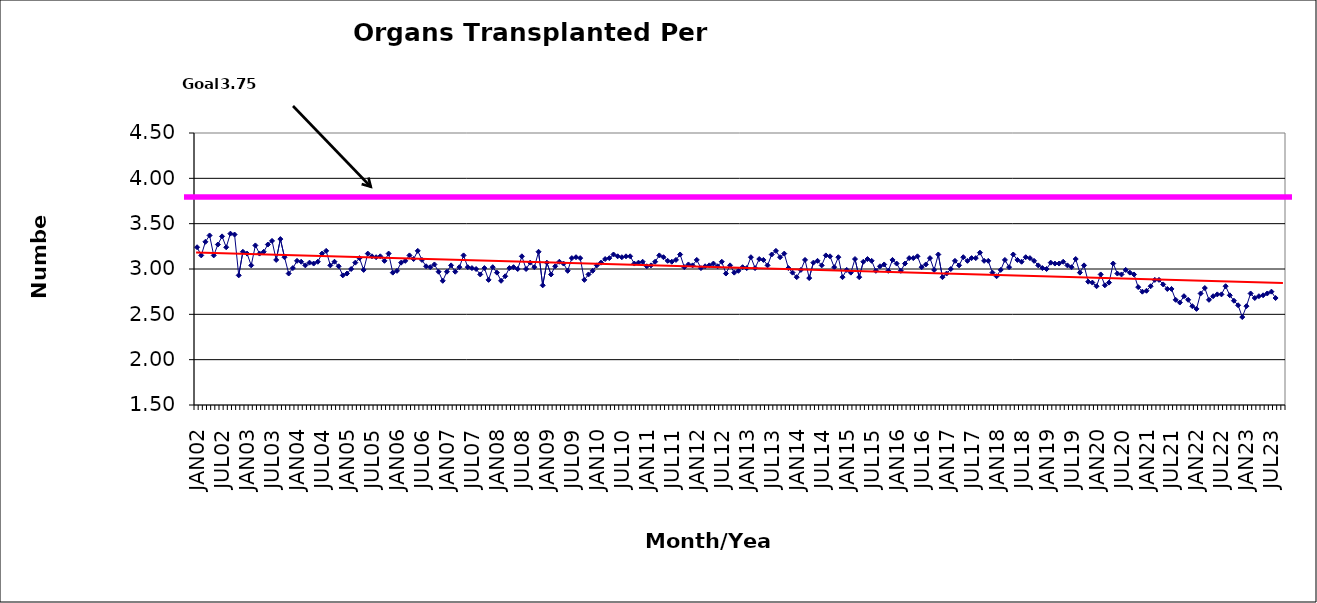
| Category | Series 0 |
|---|---|
| JAN02 | 3.24 |
| FEB02 | 3.15 |
| MAR02 | 3.3 |
| APR02 | 3.37 |
| MAY02 | 3.15 |
| JUN02 | 3.27 |
| JUL02 | 3.36 |
| AUG02 | 3.24 |
| SEP02 | 3.39 |
| OCT02 | 3.38 |
| NOV02 | 2.93 |
| DEC02 | 3.19 |
| JAN03 | 3.17 |
| FEB03 | 3.04 |
| MAR03 | 3.26 |
| APR03 | 3.17 |
| MAY03 | 3.19 |
| JUN03 | 3.27 |
| JUL03 | 3.31 |
| AUG03 | 3.1 |
| SEP03 | 3.33 |
| OCT03 | 3.13 |
| NOV03 | 2.95 |
| DEC03 | 3.01 |
| JAN04 | 3.09 |
| FEB04 | 3.08 |
| MAR04 | 3.04 |
| APR04 | 3.07 |
| MAY04 | 3.06 |
| JUN04 | 3.08 |
| JUL04 | 3.17 |
| AUG04 | 3.2 |
| SEP04 | 3.04 |
| OCT04 | 3.08 |
| NOV04 | 3.03 |
| DEC04 | 2.93 |
| JAN05 | 2.95 |
| FEB05 | 3 |
| MAR05 | 3.07 |
| APR05 | 3.12 |
| MAY05 | 2.99 |
| JUN05 | 3.17 |
| JUL05 | 3.14 |
| AUG05 | 3.13 |
| SEP05 | 3.14 |
| OCT05 | 3.09 |
| NOV05 | 3.17 |
| DEC05 | 2.96 |
| JAN06 | 2.98 |
| FEB06 | 3.07 |
| MAR06 | 3.09 |
| APR06 | 3.15 |
| MAY06 | 3.11 |
| JUN06 | 3.2 |
| JUL06 | 3.1 |
| AUG06 | 3.03 |
| SEP06 | 3.02 |
| OCT06 | 3.05 |
| NOV06 | 2.97 |
| DEC06 | 2.87 |
| JAN07 | 2.97 |
| FEB07 | 3.04 |
| MAR07 | 2.97 |
| APR07 | 3.02 |
| MAY07 | 3.15 |
| JUN07 | 3.02 |
| JUL07 | 3.01 |
| AUG07 | 3 |
| SEP07 | 2.94 |
| OCT07 | 3.01 |
| NOV07 | 2.88 |
| DEC07 | 3.02 |
| JAN08 | 2.96 |
| FEB08 | 2.87 |
| MAR08 | 2.92 |
| APR08 | 3.01 |
| MAY08 | 3.02 |
| JUN08 | 3 |
| JUL08 | 3.14 |
| AUG08 | 3 |
| SEP08 | 3.07 |
| OCT08 | 3.02 |
| NOV08 | 3.19 |
| DEC08 | 2.82 |
| JAN09 | 3.07 |
| FEB09 | 2.94 |
| MAR09 | 3.03 |
| APR09 | 3.08 |
| MAY09 | 3.06 |
| JUN09 | 2.98 |
| JUL09 | 3.12 |
| AUG09 | 3.13 |
| SEP09 | 3.12 |
| OCT09 | 2.88 |
| NOV09 | 2.94 |
| DEC09 | 2.98 |
| JAN10 | 3.04 |
| FEB10 | 3.07 |
| MAR10 | 3.11 |
| APR10 | 3.12 |
| MAY10 | 3.16 |
| JUN10 | 3.14 |
| JUL10 | 3.13 |
| AUG10 | 3.14 |
| SEP10 | 3.14 |
| OCT10 | 3.06 |
| NOV10 | 3.07 |
| DEC10 | 3.08 |
| JAN11 | 3.03 |
| FEB11 | 3.04 |
| MAR11 | 3.08 |
| APR11 | 3.15 |
| MAY11 | 3.13 |
| JUN11 | 3.09 |
| JUL11 | 3.08 |
| AUG11 | 3.1 |
| SEP11 | 3.16 |
| OCT11 | 3.02 |
| NOV11 | 3.05 |
| DEC11 | 3.04 |
| JAN12 | 3.1 |
| FEB12 | 3.01 |
| MAR12 | 3.03 |
| APR12 | 3.04 |
| MAY12 | 3.06 |
| JUN12 | 3.03 |
| JUL12 | 3.08 |
| AUG12 | 2.95 |
| SEP12 | 3.04 |
| OCT12 | 2.96 |
| NOV12 | 2.98 |
| DEC12 | 3.02 |
| JAN13 | 3.01 |
| FEB13 | 3.13 |
| MAR13 | 3.01 |
| APR13 | 3.11 |
| MAY13 | 3.1 |
| JUN13 | 3.04 |
| JUL13 | 3.16 |
| AUG13 | 3.2 |
| SEP13 | 3.13 |
| OCT13 | 3.17 |
| NOV13 | 3.01 |
| DEC13 | 2.96 |
| JAN14 | 2.91 |
| FEB14 | 2.99 |
| MAR14 | 3.1 |
| APR14 | 2.9 |
| MAY14 | 3.07 |
| JUN14 | 3.09 |
| JUL14 | 3.04 |
| AUG14 | 3.15 |
| SEP14 | 3.14 |
| OCT14 | 3.02 |
| NOV14 | 3.13 |
| DEC14 | 2.91 |
| JAN15 | 2.99 |
| FEB15 | 2.96 |
| MAR15 | 3.11 |
| APR15 | 2.91 |
| MAY15 | 3.08 |
| JUN15 | 3.11 |
| JUL15 | 3.09 |
| AUG15 | 2.98 |
| SEP15 | 3.03 |
| OCT15 | 3.05 |
| NOV15 | 2.98 |
| DEC15 | 3.1 |
| JAN16 | 3.06 |
| FEB16 | 2.98 |
| MAR16 | 3.06 |
| APR16 | 3.12 |
| MAY16 | 3.12 |
| JUN16 | 3.14 |
| JUL16 | 3.02 |
| AUG16 | 3.05 |
| SEP16 | 3.12 |
| OCT16 | 2.99 |
| NOV16 | 3.16 |
| DEC16 | 2.91 |
| JAN17 | 2.95 |
| FEB17 | 3 |
| MAR17 | 3.09 |
| APR17 | 3.04 |
| MAY17 | 3.13 |
| JUN17 | 3.09 |
| JUL17 | 3.12 |
| AUG17 | 3.12 |
| SEP17 | 3.18 |
| OCT17 | 3.09 |
| NOV17 | 3.09 |
| DEC17 | 2.96 |
| JAN18 | 2.92 |
| FEB18 | 2.99 |
| MAR18 | 3.1 |
| APR18 | 3.02 |
| MAY18 | 3.16 |
| JUN18 | 3.1 |
| JUL18 | 3.08 |
| AUG18 | 3.13 |
| SEP18 | 3.12 |
| OCT18 | 3.09 |
| NOV18 | 3.04 |
| DEC18 | 3.01 |
| JAN19 | 3 |
| FEB19 | 3.07 |
| MAR19 | 3.06 |
| APR19 | 3.06 |
| MAY19 | 3.08 |
| JUN19 | 3.04 |
| JUL19 | 3.02 |
| AUG19 | 3.11 |
| SEP19 | 2.96 |
| OCT19 | 3.04 |
| NOV19 | 2.86 |
| DEC19 | 2.85 |
| JAN20 | 2.81 |
| FEB20 | 2.94 |
| MAR20 | 2.82 |
| APR20 | 2.85 |
| MAY20 | 3.06 |
| JUN20 | 2.95 |
| JUL20 | 2.94 |
| AUG20 | 2.99 |
| SEP20 | 2.96 |
| OCT20 | 2.94 |
| NOV20 | 2.8 |
| DEC20 | 2.75 |
| JAN21 | 2.76 |
| FEB21 | 2.81 |
| MAR21 | 2.88 |
| APR21 | 2.88 |
| MAY21 | 2.83 |
| JUN21 | 2.78 |
| JUL21 | 2.78 |
| AUG21 | 2.66 |
| SEP21 | 2.63 |
| OCT21 | 2.7 |
| NOV21 | 2.66 |
| DEC21 | 2.59 |
| JAN22 | 2.56 |
| FEB22 | 2.73 |
| MAR22 | 2.79 |
| APR22 | 2.66 |
| MAY22 | 2.7 |
| JUN22 | 2.72 |
| JUL22 | 2.72 |
| AUG22 | 2.81 |
| SEP22 | 2.71 |
| OCT22 | 2.65 |
| NOV22 | 2.6 |
| DEC22 | 2.47 |
| JAN23 | 2.59 |
| FEB23 | 2.73 |
| MAR23 | 2.68 |
| APR23 | 2.7 |
| MAY23 | 2.71 |
| JUN23 | 2.73 |
| JUL23 | 2.75 |
| AUG23 | 2.68 |